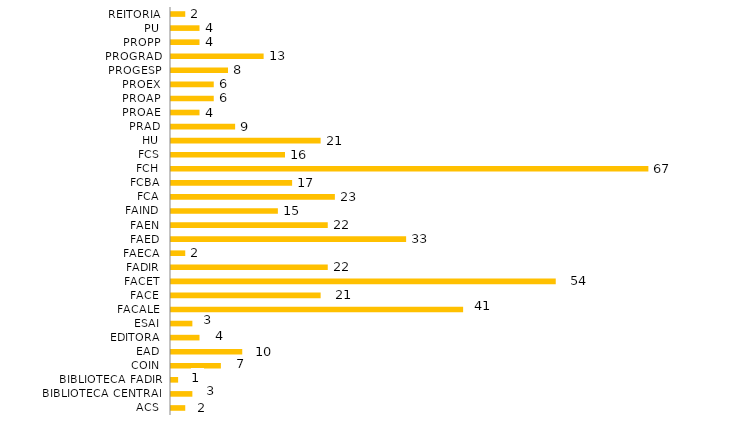
| Category | Lotação/Ano |
|---|---|
| ACS | 2 |
| BIBLIOTECA CENTRAL | 3 |
| BIBLIOTECA FADIR | 1 |
| COIN | 7 |
| EAD | 10 |
| EDITORA | 4 |
| ESAI | 3 |
| FACALE | 41 |
| FACE | 21 |
| FACET | 54 |
| FADIR | 22 |
| FAECA | 2 |
| FAED | 33 |
| FAEN | 22 |
| FAIND | 15 |
| FCA | 23 |
| FCBA | 17 |
| FCH | 67 |
| FCS | 16 |
| HU | 21 |
| PRAD | 9 |
| PROAE | 4 |
| PROAP | 6 |
| PROEX | 6 |
| PROGESP | 8 |
| PROGRAD | 13 |
| PROPP | 4 |
| PU | 4 |
| REITORIA | 2 |